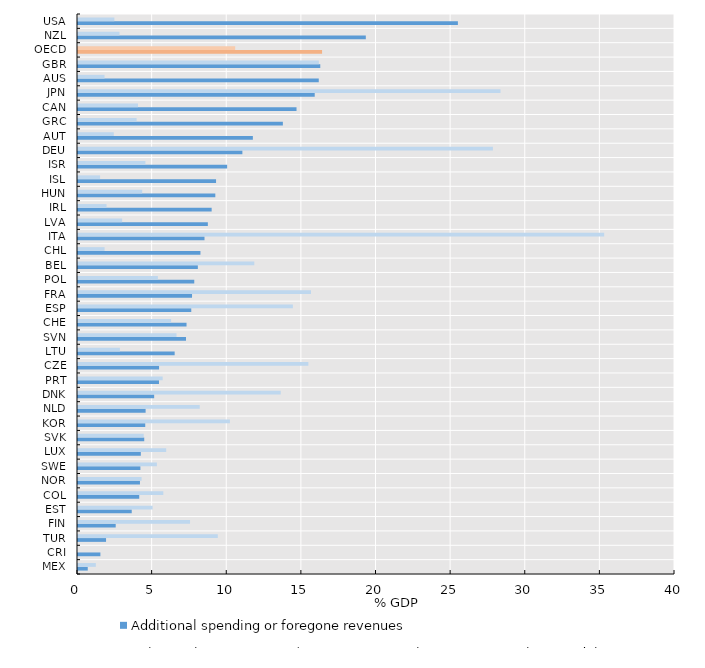
| Category | Additional spending or foregone revenues | Balance sheet measures (equity injections, loans, asset purchase or debt assumptions, contingent liabilities) |
|---|---|---|
| MEX | 0.653 | 1.195 |
| CRI | 1.5 | 0 |
| TUR | 1.879 | 9.367 |
| FIN | 2.526 | 7.506 |
| EST | 3.6 | 5 |
| COL | 4.102 | 5.716 |
| NOR | 4.151 | 4.26 |
| SWE | 4.181 | 5.285 |
| LUX | 4.209 | 5.909 |
| SVK | 4.438 | 4.402 |
| KOR | 4.505 | 10.18 |
| NLD | 4.53 | 8.156 |
| DNK | 5.103 | 13.584 |
| PRT | 5.427 | 5.673 |
| CZE | 5.432 | 15.435 |
| LTU | 6.476 | 2.808 |
| SVN | 7.236 | 6.6 |
| CHE | 7.272 | 6.238 |
| ESP | 7.589 | 14.397 |
| FRA | 7.641 | 15.611 |
| POL | 7.79 | 5.352 |
| BEL | 8.03 | 11.811 |
| CHL | 8.204 | 1.781 |
| ITA | 8.477 | 35.254 |
| LVA | 8.7 | 2.958 |
| IRL | 8.955 | 1.911 |
| HUN | 9.2 | 4.3 |
| ISL | 9.25 | 1.479 |
| ISR | 9.992 | 4.516 |
| DEU | 11.014 | 27.798 |
| AUT | 11.716 | 2.396 |
| GRC | 13.727 | 3.926 |
| CAN | 14.641 | 4.02 |
| JPN | 15.861 | 28.308 |
| AUS | 16.131 | 1.778 |
| GBR | 16.232 | 16.138 |
| OECD | 16.354 | 10.532 |
| NZL | 19.284 | 2.779 |
| USA | 25.453 | 2.436 |